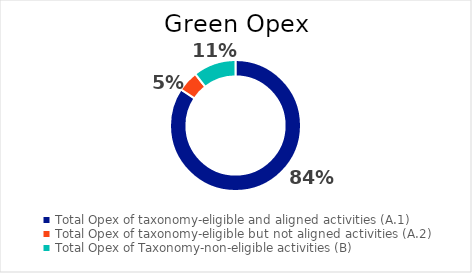
| Category | Series 0 |
|---|---|
| Total Opex of taxonomy-eligible and aligned activities (A.1) | 0.843 |
| Total Opex of taxonomy-eligible but not aligned activities (A.2) | 0.051 |
| Total Opex of Taxonomy-non-eligible activities (B) | 0.106 |